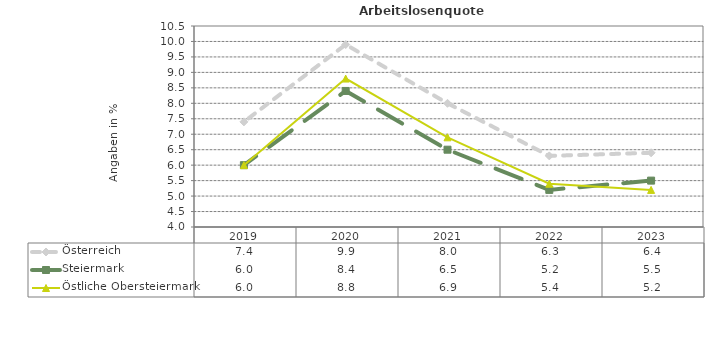
| Category | Österreich | Steiermark | Östliche Obersteiermark |
|---|---|---|---|
| 2023.0 | 6.4 | 5.5 | 5.2 |
| 2022.0 | 6.3 | 5.2 | 5.4 |
| 2021.0 | 8 | 6.5 | 6.9 |
| 2020.0 | 9.9 | 8.4 | 8.8 |
| 2019.0 | 7.4 | 6 | 6 |